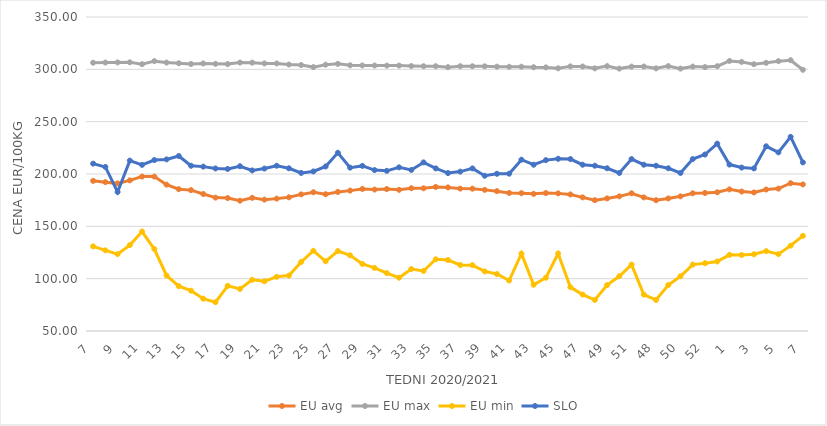
| Category | EU avg | EU max | EU min | SLO |
|---|---|---|---|---|
| 7.0 | 193.453 | 306.33 | 130.863 | 209.91 |
| 8.0 | 192.201 | 306.48 | 127.071 | 206.73 |
| 9.0 | 191.052 | 306.62 | 123.433 | 182.84 |
| 10.0 | 193.933 | 306.73 | 132.064 | 212.78 |
| 11.0 | 197.552 | 304.92 | 145.006 | 208.73 |
| 12.0 | 197.533 | 307.82 | 128.293 | 213.32 |
| 13.0 | 189.839 | 306.44 | 103.04 | 213.96 |
| 14.0 | 185.504 | 305.8 | 92.836 | 217.19 |
| 15.0 | 184.591 | 305.08 | 88.508 | 207.87 |
| 16.0 | 180.892 | 305.63 | 80.873 | 207.05 |
| 17.0 | 177.437 | 305.27 | 77.506 | 205.29 |
| 18.0 | 176.995 | 305.01 | 93.104 | 204.82 |
| 19.0 | 174.49 | 306.49 | 90.169 | 207.44 |
| 20.0 | 177.204 | 306.38 | 98.928 | 203.41 |
| 21.0 | 175.519 | 305.66 | 97.454 | 205.19 |
| 22.0 | 176.473 | 305.64 | 101.792 | 207.91 |
| 23.0 | 177.741 | 304.59 | 102.918 | 205.46 |
| 24.0 | 180.501 | 304.1 | 115.936 | 201 |
| 25.0 | 182.568 | 302.13 | 126.655 | 202.43 |
| 26.0 | 180.667 | 304.43 | 116.597 | 207.19 |
| 27.0 | 182.833 | 305.22 | 126.397 | 220.25 |
| 28.0 | 184.121 | 303.88 | 122.317 | 206.06 |
| 29.0 | 185.712 | 303.73 | 114.082 | 207.73 |
| 30.0 | 185.141 | 303.63 | 110.314 | 203.73 |
| 31.0 | 185.621 | 303.57 | 105.336 | 203 |
| 32.0 | 184.887 | 303.58 | 100.908 | 206.36 |
| 33.0 | 186.411 | 303.17 | 109.191 | 203.88 |
| 34.0 | 186.338 | 302.96 | 107.355 | 211.07 |
| 35.0 | 187.628 | 302.99 | 118.534 | 205.34 |
| 36.0 | 187.19 | 302.05 | 117.814 | 200.88 |
| 37.0 | 186.038 | 302.98 | 113.058 | 202.29 |
| 38.0 | 185.986 | 302.94 | 112.896 | 205.33 |
| 39.0 | 184.836 | 302.88 | 106.953 | 198.33 |
| 40.0 | 183.595 | 302.56 | 104.426 | 200.21 |
| 41.0 | 181.893 | 302.44 | 98.23 | 200.3 |
| 42.0 | 181.671 | 302.52 | 123.908 | 213.66 |
| 43.0 | 181.023 | 302.01 | 94.177 | 208.86 |
| 44.0 | 181.795 | 301.86 | 100.908 | 213.25 |
| 45.0 | 181.489 | 300.98 | 124 | 214.51 |
| 46.0 | 180.473 | 302.82 | 91.889 | 214.27 |
| 47.0 | 177.656 | 302.7 | 84.832 | 208.87 |
| 48.0 | 174.977 | 300.94 | 79.697 | 207.9 |
| 49.0 | 176.65 | 303.09 | 93.873 | 205.48 |
| 50.0 | 178.648 | 300.7 | 102.316 | 200.99 |
| 51.0 | 181.58 | 302.62 | 113.46 | 214.25 |
| 47.0 | 177.656 | 302.7 | 84.832 | 208.87 |
| 48.0 | 174.977 | 300.94 | 79.697 | 207.9 |
| 49.0 | 176.65 | 303.09 | 93.873 | 205.48 |
| 50.0 | 178.648 | 300.7 | 102.316 | 200.99 |
| 51.0 | 181.58 | 302.62 | 113.46 | 214.25 |
| 52.0 | 181.9 | 302.14 | 114.76 | 218.61 |
| 53.0 | 182.536 | 303 | 116.375 | 229 |
| 1.0 | 185.3 | 308 | 122.769 | 209 |
| 2.0 | 183.25 | 307.1 | 122.609 | 206.15 |
| 3.0 | 182.393 | 304.91 | 123.32 | 205.35 |
| 4.0 | 185.158 | 306.22 | 126.329 | 226.48 |
| 5.0 | 186.04 | 307.79 | 123.461 | 220.65 |
| 6.0 | 191.206 | 308.7 | 131.528 | 235.46 |
| 7.0 | 190.028 | 299.55 | 140.902 | 211.1 |